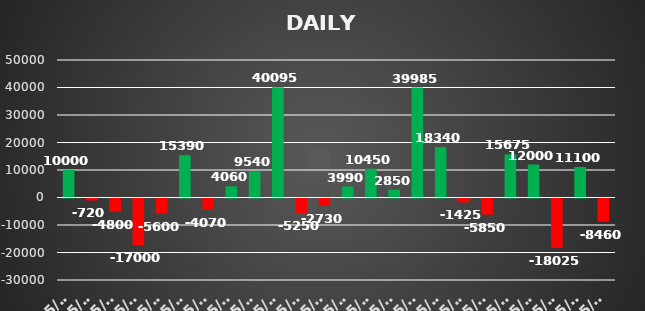
| Category | Series 0 |
|---|---|
| 2023-05-02 | 10000 |
| 2023-05-03 | -720 |
| 2023-05-04 | -4800 |
| 2023-05-05 | -17000 |
| 2023-05-08 | -5600 |
| 2023-05-08 | 15390 |
| 2023-05-09 | -4070 |
| 2023-05-09 | 4060 |
| 2023-05-10 | 9540 |
| 2023-05-11 | 40095 |
| 2023-05-12 | -5250 |
| 2023-05-15 | -2730 |
| 2023-05-16 | 3990 |
| 2023-05-17 | 10450 |
| 2023-05-18 | 2850 |
| 2023-05-19 | 39985 |
| 2023-05-22 | 18340 |
| 2023-05-23 | -1425 |
| 2023-05-24 | -5850 |
| 2023-05-25 | 15675 |
| 2023-05-26 | 12000 |
| 2023-05-29 | -18025 |
| 2023-05-30 | 11100 |
| 2023-05-31 | -8460 |